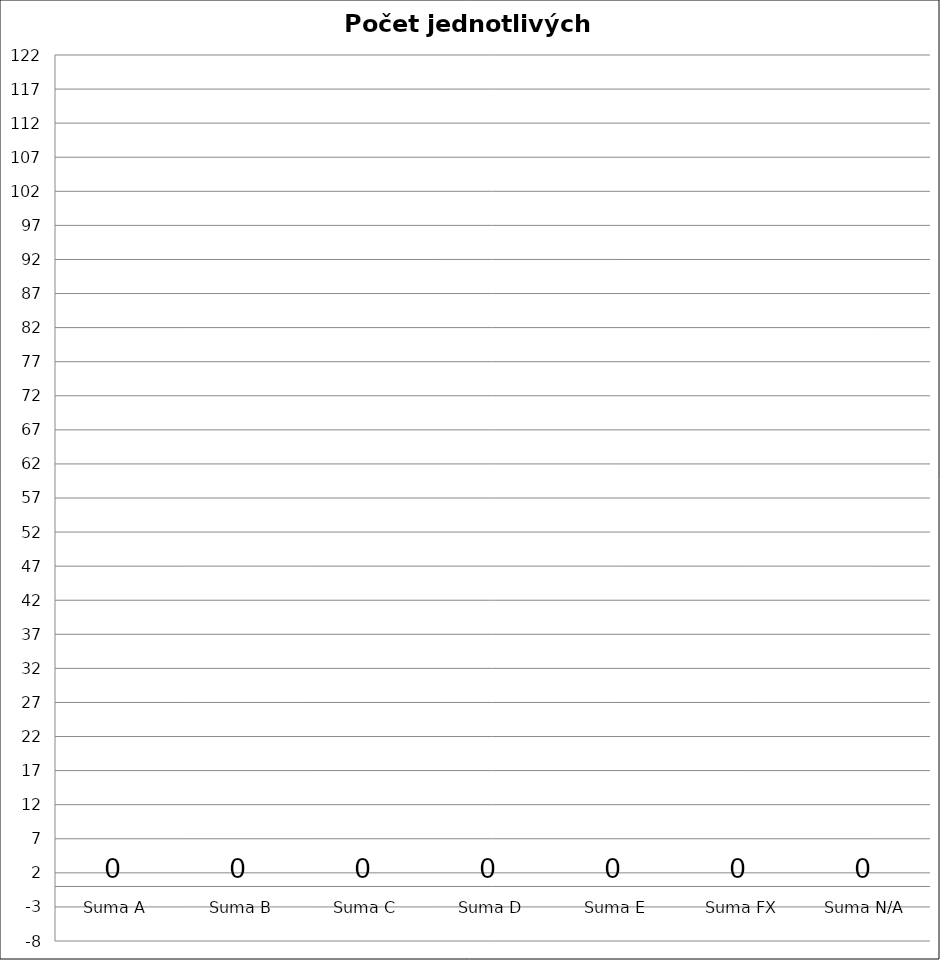
| Category | Series 0 |
|---|---|
| Suma A | 0 |
| Suma B | 0 |
| Suma C | 0 |
| Suma D | 0 |
| Suma E | 0 |
| Suma FX | 0 |
| Suma N/A | 0 |